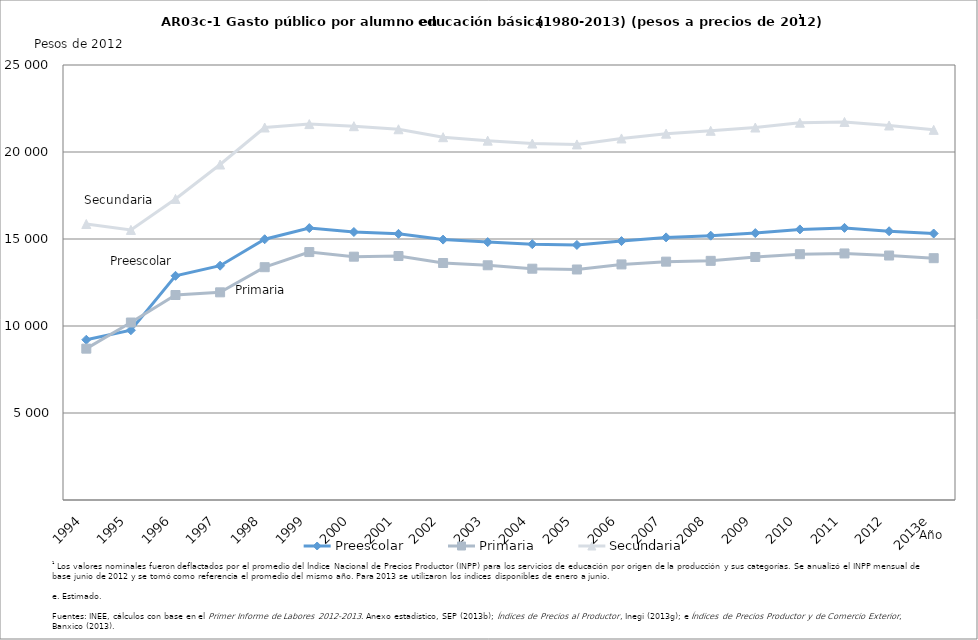
| Category | Preescolar | Primaria | Secundaria |
|---|---|---|---|
| 1994 | 9210 | 8698 | 15862 |
| 1995 | 9757 | 10200 | 15522 |
| 1996 | 12885 | 11781 | 17303 |
| 1997 | 13466 | 11935 | 19280 |
| 1998 | 14986 | 13380 | 21408 |
| 1999 | 15628 | 14249 | 21604 |
| 2000 | 15403 | 13984 | 21483 |
| 2001 | 15297 | 14022 | 21307 |
| 2002 | 14965 | 13620 | 20851 |
| 2003 | 14822 | 13490 | 20652 |
| 2004 | 14701 | 13293 | 20487 |
| 2005 | 14658 | 13248 | 20436 |
| 2006 | 14880 | 13539 | 20778 |
| 2007 | 15093 | 13698 | 21054 |
| 2008 | 15190 | 13744 | 21218 |
| 2009 | 15340 | 13966 | 21407 |
| 2010 | 15551 | 14127 | 21683 |
| 2011 | 15639 | 14169 | 21726 |
| 2012 | 15445 | 14050 | 21523 |
| 2013e | 15316 | 13898 | 21273 |